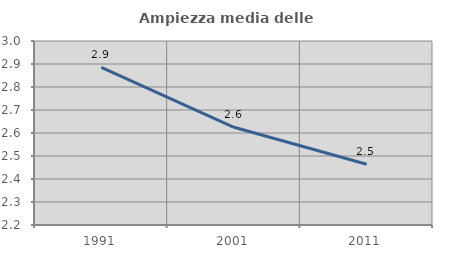
| Category | Ampiezza media delle famiglie |
|---|---|
| 1991.0 | 2.885 |
| 2001.0 | 2.625 |
| 2011.0 | 2.464 |